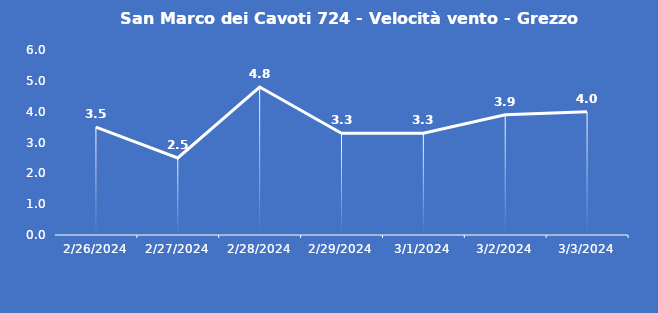
| Category | San Marco dei Cavoti 724 - Velocità vento - Grezzo (m/s) |
|---|---|
| 2/26/24 | 3.5 |
| 2/27/24 | 2.5 |
| 2/28/24 | 4.8 |
| 2/29/24 | 3.3 |
| 3/1/24 | 3.3 |
| 3/2/24 | 3.9 |
| 3/3/24 | 4 |